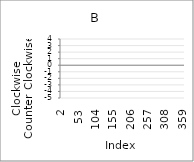
| Category | Series 0 |
|---|---|
| 2.0 | 3 |
| 3.0 | 1 |
| 4.0 | -5 |
| 5.0 | 1 |
| 6.0 | -3 |
| 7.0 | -3 |
| 8.0 | 1 |
| 9.0 | 1 |
| 10.0 | -3 |
| 11.0 | 4 |
| 12.0 | -4 |
| 13.0 | -4 |
| 14.0 | -1 |
| 15.0 | -2 |
| 16.0 | -4 |
| 17.0 | -5 |
| 18.0 | -3 |
| 19.0 | -5 |
| 20.0 | -4 |
| 21.0 | 0 |
| 22.0 | -4 |
| 23.0 | -5 |
| 24.0 | 0 |
| 25.0 | 1 |
| 26.0 | -1 |
| 27.0 | 0 |
| 28.0 | 3 |
| 29.0 | -3 |
| 30.0 | -3 |
| 31.0 | -5 |
| 32.0 | 4 |
| 33.0 | -2 |
| 34.0 | -1 |
| 35.0 | -3 |
| 36.0 | -3 |
| 37.0 | -4 |
| 38.0 | 0 |
| 39.0 | -1 |
| 40.0 | -1 |
| 41.0 | 3 |
| 42.0 | 4 |
| 43.0 | -2 |
| 44.0 | 0 |
| 45.0 | 4 |
| 46.0 | 2 |
| 47.0 | 4 |
| 48.0 | -5 |
| 49.0 | -4 |
| 50.0 | -4 |
| 51.0 | 3 |
| 52.0 | 4 |
| 53.0 | 3 |
| 54.0 | -5 |
| 55.0 | -4 |
| 56.0 | -2 |
| 57.0 | -2 |
| 58.0 | -1 |
| 59.0 | -1 |
| 60.0 | -2 |
| 61.0 | -5 |
| 62.0 | 3 |
| 63.0 | 2 |
| 64.0 | -4 |
| 65.0 | 0 |
| 66.0 | 2 |
| 67.0 | 4 |
| 68.0 | -4 |
| 69.0 | -4 |
| 70.0 | 4 |
| 71.0 | 1 |
| 72.0 | -4 |
| 73.0 | -2 |
| 74.0 | -1 |
| 75.0 | -2 |
| 76.0 | -2 |
| 77.0 | -4 |
| 78.0 | 3 |
| 79.0 | 0 |
| 80.0 | 2 |
| 81.0 | -5 |
| 82.0 | -5 |
| 83.0 | -3 |
| 84.0 | 2 |
| 85.0 | -1 |
| 86.0 | 2 |
| 87.0 | -1 |
| 88.0 | -2 |
| 89.0 | 3 |
| 90.0 | -1 |
| 91.0 | -2 |
| 92.0 | -2 |
| 93.0 | 1 |
| 94.0 | -5 |
| 95.0 | -5 |
| 96.0 | -4 |
| 97.0 | -1 |
| 98.0 | 3 |
| 99.0 | 2 |
| 100.0 | -3 |
| 101.0 | -3 |
| 102.0 | 1 |
| 103.0 | -3 |
| 104.0 | 3 |
| 105.0 | 2 |
| 106.0 | -5 |
| 107.0 | 3 |
| 108.0 | -1 |
| 109.0 | 1 |
| 110.0 | 2 |
| 111.0 | -3 |
| 112.0 | -3 |
| 113.0 | 3 |
| 114.0 | 2 |
| 115.0 | -2 |
| 116.0 | 1 |
| 117.0 | -5 |
| 118.0 | -4 |
| 119.0 | 2 |
| 120.0 | -3 |
| 121.0 | -4 |
| 122.0 | 1 |
| 123.0 | 1 |
| 124.0 | -4 |
| 125.0 | 2 |
| 126.0 | 1 |
| 127.0 | -3 |
| 128.0 | -1 |
| 129.0 | 3 |
| 130.0 | -3 |
| 131.0 | 4 |
| 132.0 | 0 |
| 133.0 | 4 |
| 134.0 | -5 |
| 135.0 | -3 |
| 136.0 | -4 |
| 137.0 | -1 |
| 138.0 | -1 |
| 139.0 | 2 |
| 140.0 | -4 |
| 141.0 | -1 |
| 142.0 | -3 |
| 143.0 | -1 |
| 144.0 | 4 |
| 145.0 | 3 |
| 146.0 | 4 |
| 147.0 | 1 |
| 148.0 | 3 |
| 149.0 | 4 |
| 150.0 | -1 |
| 151.0 | 4 |
| 152.0 | 0 |
| 153.0 | -1 |
| 154.0 | -2 |
| 155.0 | 2 |
| 156.0 | 4 |
| 157.0 | 4 |
| 158.0 | -3 |
| 159.0 | 4 |
| 160.0 | 1 |
| 161.0 | 3 |
| 162.0 | 0 |
| 163.0 | -1 |
| 164.0 | -4 |
| 165.0 | -2 |
| 166.0 | 4 |
| 167.0 | 4 |
| 168.0 | 2 |
| 169.0 | -4 |
| 170.0 | 0 |
| 171.0 | -3 |
| 172.0 | 0 |
| 173.0 | -5 |
| 174.0 | 0 |
| 175.0 | -3 |
| 176.0 | 4 |
| 177.0 | 2 |
| 178.0 | -3 |
| 179.0 | 4 |
| 180.0 | -4 |
| 181.0 | 2 |
| 182.0 | 2 |
| 183.0 | -4 |
| 184.0 | -1 |
| 185.0 | -2 |
| 186.0 | -1 |
| 187.0 | 2 |
| 188.0 | 4 |
| 189.0 | 2 |
| 190.0 | -1 |
| 191.0 | -4 |
| 192.0 | 4 |
| 193.0 | 3 |
| 194.0 | -1 |
| 195.0 | -2 |
| 196.0 | 2 |
| 197.0 | 2 |
| 198.0 | 1 |
| 199.0 | 0 |
| 200.0 | -3 |
| 201.0 | 1 |
| 202.0 | 4 |
| 203.0 | -2 |
| 204.0 | 0 |
| 205.0 | -2 |
| 206.0 | 0 |
| 207.0 | -2 |
| 208.0 | 0 |
| 209.0 | -1 |
| 210.0 | 2 |
| 211.0 | 3 |
| 212.0 | -4 |
| 213.0 | -2 |
| 214.0 | -5 |
| 215.0 | 4 |
| 216.0 | -4 |
| 217.0 | -3 |
| 218.0 | -4 |
| 219.0 | -3 |
| 220.0 | 2 |
| 221.0 | -3 |
| 222.0 | 4 |
| 223.0 | -2 |
| 224.0 | -5 |
| 225.0 | -4 |
| 226.0 | -1 |
| 227.0 | 2 |
| 228.0 | 1 |
| 229.0 | 2 |
| 230.0 | -2 |
| 231.0 | -1 |
| 232.0 | -2 |
| 233.0 | -4 |
| 234.0 | -4 |
| 235.0 | -5 |
| 236.0 | 3 |
| 237.0 | 0 |
| 238.0 | 0 |
| 239.0 | 2 |
| 240.0 | 0 |
| 241.0 | -1 |
| 242.0 | 3 |
| 243.0 | 0 |
| 244.0 | 4 |
| 245.0 | 1 |
| 246.0 | 0 |
| 247.0 | -4 |
| 248.0 | 1 |
| 249.0 | 3 |
| 250.0 | 2 |
| 251.0 | -2 |
| 252.0 | 0 |
| 253.0 | -1 |
| 254.0 | -1 |
| 255.0 | -5 |
| 256.0 | -4 |
| 257.0 | 0 |
| 258.0 | 0 |
| 259.0 | 0 |
| 260.0 | 3 |
| 261.0 | 1 |
| 262.0 | 3 |
| 263.0 | 1 |
| 264.0 | -3 |
| 265.0 | -5 |
| 266.0 | -2 |
| 267.0 | -4 |
| 268.0 | 1 |
| 269.0 | -5 |
| 270.0 | -5 |
| 271.0 | 4 |
| 272.0 | 4 |
| 273.0 | -4 |
| 274.0 | 4 |
| 275.0 | -1 |
| 276.0 | 1 |
| 277.0 | 4 |
| 278.0 | 2 |
| 279.0 | 3 |
| 280.0 | -5 |
| 281.0 | -4 |
| 282.0 | -3 |
| 283.0 | -1 |
| 284.0 | 2 |
| 285.0 | -1 |
| 286.0 | 3 |
| 287.0 | -5 |
| 288.0 | 4 |
| 289.0 | 0 |
| 290.0 | 4 |
| 291.0 | 1 |
| 292.0 | -5 |
| 293.0 | -1 |
| 294.0 | -2 |
| 295.0 | 1 |
| 296.0 | -3 |
| 297.0 | -3 |
| 298.0 | -1 |
| 299.0 | -4 |
| 300.0 | -5 |
| 301.0 | 2 |
| 302.0 | 3 |
| 303.0 | 3 |
| 304.0 | -4 |
| 305.0 | 1 |
| 306.0 | 2 |
| 307.0 | 2 |
| 308.0 | 2 |
| 309.0 | 4 |
| 310.0 | -4 |
| 311.0 | -5 |
| 312.0 | 1 |
| 313.0 | 3 |
| 314.0 | -1 |
| 315.0 | 0 |
| 316.0 | 0 |
| 317.0 | -2 |
| 318.0 | 1 |
| 319.0 | -2 |
| 320.0 | 3 |
| 321.0 | -4 |
| 322.0 | -1 |
| 323.0 | -4 |
| 324.0 | 0 |
| 325.0 | 4 |
| 326.0 | 3 |
| 327.0 | 1 |
| 328.0 | 3 |
| 329.0 | 0 |
| 330.0 | -5 |
| 331.0 | -3 |
| 332.0 | -5 |
| 333.0 | 1 |
| 334.0 | -5 |
| 335.0 | -5 |
| 336.0 | 0 |
| 337.0 | -5 |
| 338.0 | -1 |
| 339.0 | 1 |
| 340.0 | -3 |
| 341.0 | -3 |
| 342.0 | -5 |
| 343.0 | 3 |
| 344.0 | 3 |
| 345.0 | -5 |
| 346.0 | 1 |
| 347.0 | 2 |
| 348.0 | -3 |
| 349.0 | -1 |
| 350.0 | -1 |
| 351.0 | -5 |
| 352.0 | 3 |
| 353.0 | -2 |
| 354.0 | 4 |
| 355.0 | 4 |
| 356.0 | -4 |
| 357.0 | 2 |
| 358.0 | 1 |
| 359.0 | -5 |
| 360.0 | 3 |
| 361.0 | -1 |
| 362.0 | 3 |
| 363.0 | -4 |
| 364.0 | -4 |
| 365.0 | 0 |